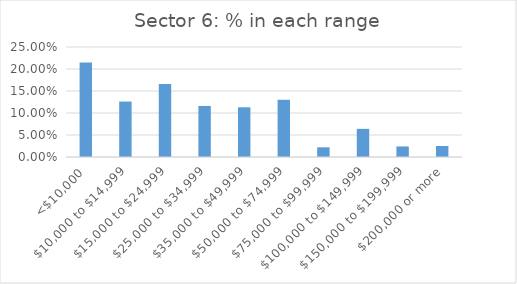
| Category | Series 0 |
|---|---|
| <$10,000 | 0.215 |
| $10,000 to $14,999 | 0.126 |
| $15,000 to $24,999 | 0.166 |
| $25,000 to $34,999 | 0.116 |
| $35,000 to $49,999 | 0.113 |
| $50,000 to $74,999 | 0.13 |
| $75,000 to $99,999 | 0.022 |
| $100,000 to $149,999 | 0.064 |
| $150,000 to $199,999 | 0.024 |
| $200,000 or more | 0.025 |